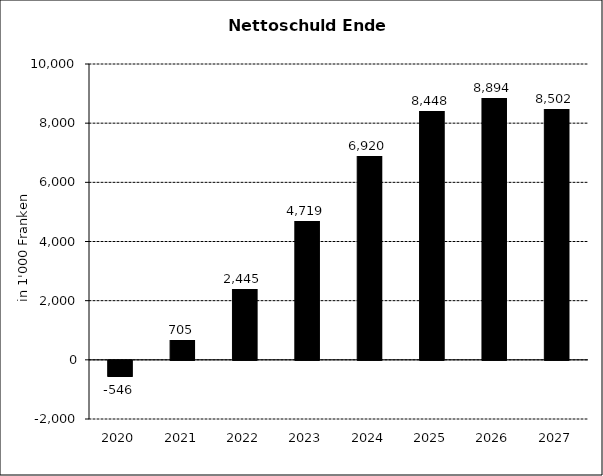
| Category | Nettoschuld Ende Jahr |
|---|---|
| 2020.0 | -546 |
| 2021.0 | 705 |
| 2022.0 | 2445 |
| 2023.0 | 4718.638 |
| 2024.0 | 6920.01 |
| 2025.0 | 8448.126 |
| 2026.0 | 8893.946 |
| 2027.0 | 8501.676 |